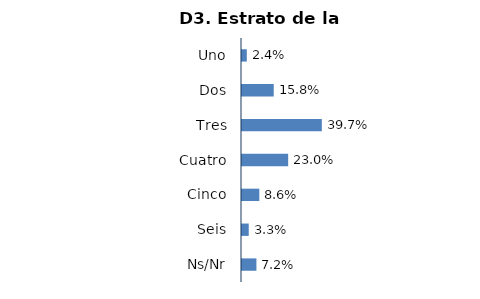
| Category | Series 0 |
|---|---|
| Uno | 0.024 |
| Dos | 0.158 |
| Tres | 0.397 |
| Cuatro | 0.23 |
| Cinco | 0.086 |
| Seis | 0.033 |
| Ns/Nr | 0.072 |